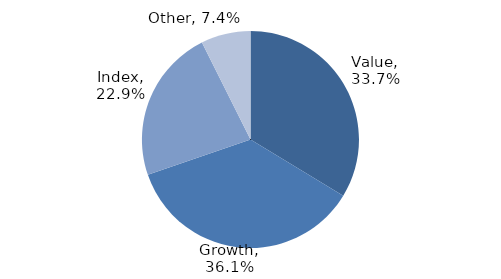
| Category | Investment Style |
|---|---|
| Value | 0.337 |
| Growth | 0.361 |
| Index | 0.229 |
| Other | 0.074 |